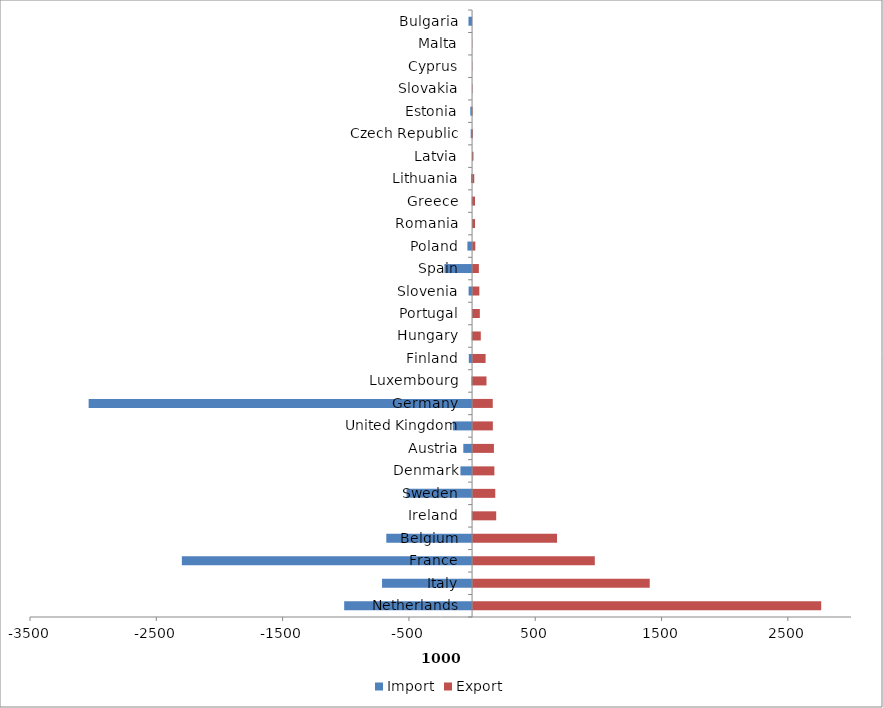
| Category | Import | Export |
|---|---|---|
| Netherlands | -1012.503 | 2764.07 |
| Italy | -712.796 | 1406.551 |
| France | -2297.782 | 971.654 |
| Belgium | -679.054 | 672.596 |
| Ireland | -2.891 | 191 |
| Sweden | -518.437 | 183.605 |
| Denmark | -92.175 | 176.661 |
| Austria | -69.29 | 172.968 |
| United Kingdom | -152.643 | 164.364 |
| Germany | -3035.807 | 163.749 |
| Luxembourg | -5.043 | 114.067 |
| Finland | -25.864 | 106.971 |
| Hungary | -3.18 | 69 |
| Portugal | -1.182 | 61.365 |
| Slovenia | -27.536 | 57.617 |
| Spain | -218.741 | 53.892 |
| Poland | -37.084 | 25.589 |
| Romania | -0.057 | 23.431 |
| Greece | -2.969 | 23.096 |
| Lithuania | -7.821 | 17.258 |
| Latvia | -0.888 | 10.895 |
| Czech Republic | -10.922 | 7.286 |
| Estonia | -14.064 | 4.664 |
| Slovakia | -0.988 | 2.979 |
| Cyprus | 0 | 2.267 |
| Malta | 0 | 1.853 |
| Bulgaria | -28.5 | 0.395 |